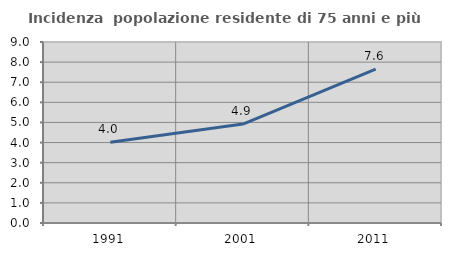
| Category | Incidenza  popolazione residente di 75 anni e più |
|---|---|
| 1991.0 | 4.014 |
| 2001.0 | 4.919 |
| 2011.0 | 7.647 |